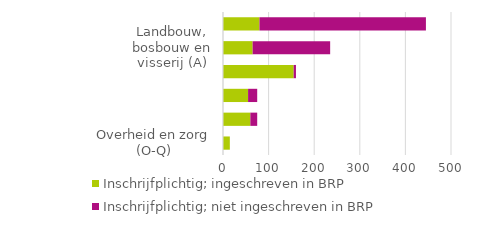
| Category | Inschrijfplichtig; ingeschreven in BRP | Inschrijfplichtig; niet ingeschreven in BRP |
|---|---|---|
| Overheid en zorg (O-Q) | 15 | 0 |
| Overig | 60 | 15 |
| Handel en horeca (G+I) | 55 | 20 |
| Nijverheid en energie (B-F) | 155 | 5 |
| Landbouw, bosbouw en visserij (A) | 65 | 170 |
| Arbeidsbemiddeling, uitzendbureaus en personeelsbeheer (78) | 80 | 365 |